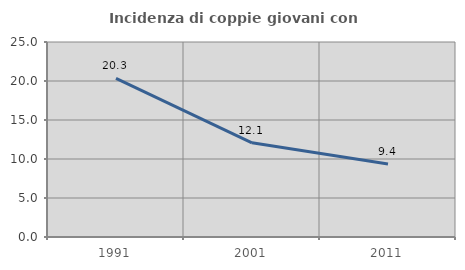
| Category | Incidenza di coppie giovani con figli |
|---|---|
| 1991.0 | 20.335 |
| 2001.0 | 12.081 |
| 2011.0 | 9.357 |